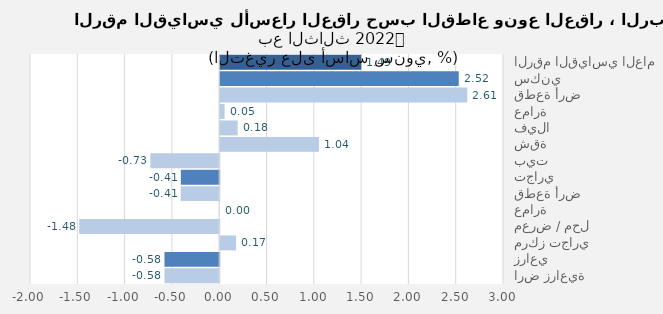
| Category | Series 0 |
|---|---|
| الرقم القياسي العام | 1.492 |
| سكني | 2.522 |
| قطعة أرض | 2.612 |
| عمارة | 0.046 |
| فيلا | 0.185 |
| شقة | 1.044 |
| بيت | -0.728 |
| تجاري | -0.406 |
| قطعة أرض | -0.406 |
| عمارة | 0 |
| معرض / محل | -1.48 |
| مركز تجاري | 0.168 |
| زراعي | -0.579 |
| ارض زراعية | -0.579 |